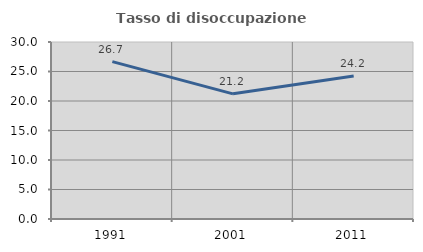
| Category | Tasso di disoccupazione giovanile  |
|---|---|
| 1991.0 | 26.667 |
| 2001.0 | 21.212 |
| 2011.0 | 24.242 |